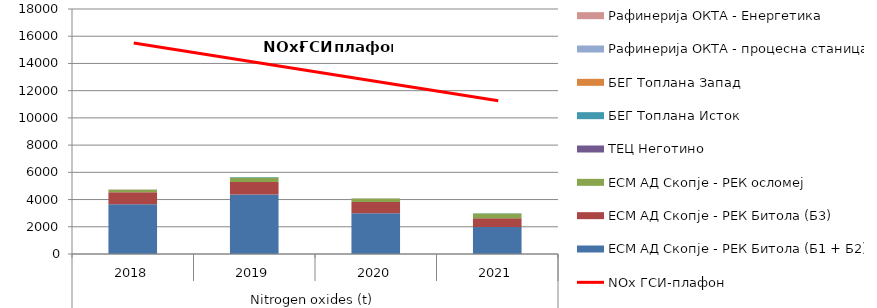
| Category | EСМ AД Скопје - РЕК Битола (Б1 + Б2) | EСМ AД Скопје - РЕК Битола (Б3) | EСМ AД Скопје - РЕК осломеј | ТЕЦ Неготино | БЕГ Топлана Исток | БЕГ Топлана Запад | Рафинерија ОКТА - процесна станица | Рафинерија ОКТА - Енергетика |
|---|---|---|---|---|---|---|---|---|
| 0 | 3649 | 891 | 168 | 0 | 20 | 9.49 | 0 | 0 |
| 1 | 4371 | 910 | 336 | 0 | 32 | 10.74 | 0 | 0 |
| 2 | 2987 | 840 | 230 | 0 | 22.5 | 10.6 | 0 | 0 |
| 3 | 1983 | 638 | 355 | 8.4 | 0.64 | 0.3 | 0 | 0 |